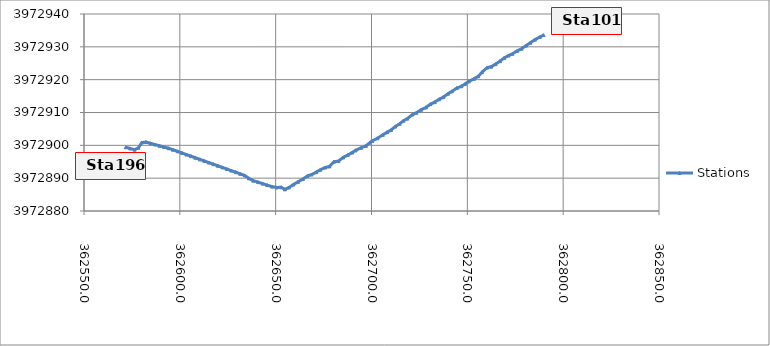
| Category | Stations |
|---|---|
| 362789.8 | 3972933.591 |
| 362787.8 | 3972932.983 |
| 362785.3 | 3972932.199 |
| 362782.9 | 3972931.27 |
| 362780.7 | 3972930.385 |
| 362778.3 | 3972929.426 |
| 362776.1 | 3972928.814 |
| 362773.6 | 3972927.9 |
| 362771.5 | 3972927.354 |
| 362769.2 | 3972926.616 |
| 362767.0 | 3972925.624 |
| 362764.7 | 3972924.717 |
| 362762.5 | 3972923.967 |
| 362760.4 | 3972923.705 |
| 362757.7 | 3972922.29 |
| 362755.7 | 3972921.034 |
| 362753.5 | 3972920.267 |
| 362750.8 | 3972919.492 |
| 362748.9 | 3972918.717 |
| 362746.9 | 3972917.993 |
| 362744.5 | 3972917.439 |
| 362741.9 | 3972916.425 |
| 362739.9 | 3972915.728 |
| 362737.5 | 3972914.682 |
| 362735.3 | 3972914.041 |
| 362733.0 | 3972913.162 |
| 362730.7 | 3972912.531 |
| 362728.4 | 3972911.551 |
| 362725.9 | 3972910.824 |
| 362723.4 | 3972909.915 |
| 362721.4 | 3972909.404 |
| 362718.7 | 3972908.139 |
| 362716.7 | 3972907.509 |
| 362714.7 | 3972906.569 |
| 362712.4 | 3972905.735 |
| 362710.2 | 3972904.653 |
| 362708.1 | 3972903.987 |
| 362705.9 | 3972903.2 |
| 362703.1 | 3972902.151 |
| 362700.5 | 3972901.384 |
| 362699.2 | 3972900.84 |
| 362697.1 | 3972899.845 |
| 362694.5 | 3972899.231 |
| 362691.7 | 3972898.474 |
| 362689.9 | 3972897.803 |
| 362687.6 | 3972897.041 |
| 362685.2 | 3972896.311 |
| 362682.8 | 3972895.191 |
| 362680.4 | 3972894.996 |
| 362678.1 | 3972893.582 |
| 362675.9 | 3972893.248 |
| 362673.3 | 3972892.573 |
| 362671.2 | 3972891.834 |
| 362668.7 | 3972891.108 |
| 362666.6 | 3972890.676 |
| 362664.2 | 3972889.721 |
| 362661.6 | 3972888.865 |
| 362659.3 | 3972888.074 |
| 362656.9 | 3972887.153 |
| 362654.8 | 3972886.598 |
| 362652.9 | 3972887.224 |
| 362650.5 | 3972887.171 |
| 362648.1 | 3972887.43 |
| 362645.6 | 3972887.886 |
| 362643.2 | 3972888.341 |
| 362640.8 | 3972888.796 |
| 362638.3 | 3972889.251 |
| 362636.0 | 3972889.949 |
| 362633.8 | 3972890.839 |
| 362631.5 | 3972891.329 |
| 362629.2 | 3972891.818 |
| 362626.8 | 3972892.308 |
| 362624.5 | 3972892.798 |
| 362622.2 | 3972893.287 |
| 362619.8 | 3972893.777 |
| 362617.5 | 3972894.267 |
| 362615.1 | 3972894.756 |
| 362612.8 | 3972895.246 |
| 362610.4 | 3972895.736 |
| 362608.1 | 3972896.225 |
| 362605.8 | 3972896.715 |
| 362603.4 | 3972897.205 |
| 362601.1 | 3972897.694 |
| 362598.8 | 3972898.184 |
| 362596.4 | 3972898.674 |
| 362594.1 | 3972899.119 |
| 362591.7 | 3972899.494 |
| 362589.4 | 3972899.87 |
| 362587.0 | 3972900.246 |
| 362584.7 | 3972900.621 |
| 362582.3 | 3972900.997 |
| 362580.2 | 3972900.857 |
| 362578.4 | 3972899.245 |
| 362576.4 | 3972898.673 |
| 362574.1 | 3972899.046 |
| 362571.8 | 3972899.419 |